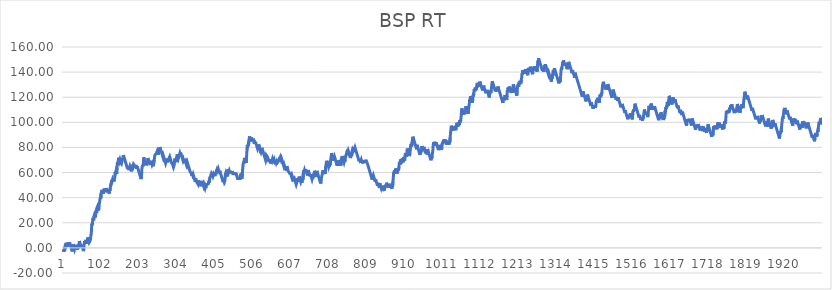
| Category | BSP RT |
|---|---|
| 0 | -1 |
| 1 | -2 |
| 2 | -3 |
| 3 | -1.15 |
| 4 | -2.15 |
| 5 | 1.08 |
| 6 | 2.88 |
| 7 | 1.88 |
| 8 | 3.99 |
| 9 | 2.99 |
| 10 | 1.99 |
| 11 | 0.99 |
| 12 | 2.58 |
| 13 | 4.52 |
| 14 | 3.52 |
| 15 | 2.52 |
| 16 | 1.52 |
| 17 | 4.21 |
| 18 | 3.21 |
| 19 | 2.21 |
| 20 | 1.21 |
| 21 | 0.21 |
| 22 | -0.79 |
| 23 | -1.79 |
| 24 | -2.79 |
| 25 | -0.12 |
| 26 | 2.92 |
| 27 | 1.92 |
| 28 | 0.92 |
| 29 | -0.08 |
| 30 | -1.08 |
| 31 | 0.15 |
| 32 | 1.6 |
| 33 | 0.6 |
| 34 | 2.42 |
| 35 | 1.42 |
| 36 | 0.42 |
| 37 | -0.58 |
| 38 | -1.58 |
| 39 | 1.62 |
| 40 | 0.62 |
| 41 | -0.38 |
| 42 | 3.05 |
| 43 | 5.45 |
| 44 | 4.45 |
| 45 | 3.45 |
| 46 | 2.45 |
| 47 | 1.45 |
| 48 | 0.45 |
| 49 | 2.45 |
| 50 | 1.45 |
| 51 | 0.45 |
| 52 | -0.55 |
| 53 | -1.55 |
| 54 | -2.55 |
| 55 | 0.1 |
| 56 | 3.81 |
| 57 | 5.38 |
| 58 | 4.38 |
| 59 | 3.38 |
| 60 | 6.36 |
| 61 | 5.36 |
| 62 | 4.36 |
| 63 | 3.36 |
| 64 | 4.69 |
| 65 | 8.32 |
| 66 | 7.32 |
| 67 | 6.32 |
| 68 | 5.32 |
| 69 | 4.32 |
| 70 | 4.77 |
| 71 | 3.77 |
| 72 | 6.03 |
| 73 | 8.37 |
| 74 | 10.33 |
| 75 | 13.27 |
| 76 | 19.15 |
| 77 | 18.15 |
| 78 | 20.52 |
| 79 | 23.83 |
| 80 | 22.83 |
| 81 | 21.83 |
| 82 | 25.36 |
| 83 | 26.36 |
| 84 | 25.36 |
| 85 | 24.36 |
| 86 | 25.64 |
| 87 | 27.8 |
| 88 | 28.86 |
| 89 | 27.86 |
| 90 | 31.93 |
| 91 | 32.75 |
| 92 | 31.75 |
| 93 | 30.75 |
| 94 | 29.75 |
| 95 | 33.54 |
| 96 | 35.16 |
| 97 | 35.75 |
| 98 | 39.38 |
| 99 | 40.38 |
| 100 | 39.38 |
| 101 | 43.95 |
| 102 | 42.95 |
| 103 | 46.18 |
| 104 | 45.18 |
| 105 | 44.18 |
| 106 | 43.18 |
| 107 | 44.65 |
| 108 | 46 |
| 109 | 47.31 |
| 110 | 46.31 |
| 111 | 45.31 |
| 112 | 44.31 |
| 113 | 46.52 |
| 114 | 45.52 |
| 115 | 47.59 |
| 116 | 46.59 |
| 117 | 45.59 |
| 118 | 44.59 |
| 119 | 46.26 |
| 120 | 45.26 |
| 121 | 44.26 |
| 122 | 43.26 |
| 123 | 46.4 |
| 124 | 45.4 |
| 125 | 47.35 |
| 126 | 50.33 |
| 127 | 51.13 |
| 128 | 52.38 |
| 129 | 54.19 |
| 130 | 53.19 |
| 131 | 54.3 |
| 132 | 53.3 |
| 133 | 54.96 |
| 134 | 53.96 |
| 135 | 52.96 |
| 136 | 54.56 |
| 137 | 56.52 |
| 138 | 60.64 |
| 139 | 59.64 |
| 140 | 60.85 |
| 141 | 59.85 |
| 142 | 58.85 |
| 143 | 64.12 |
| 144 | 68.04 |
| 145 | 67.04 |
| 146 | 66.04 |
| 147 | 71.83 |
| 148 | 70.83 |
| 149 | 69.83 |
| 150 | 68.83 |
| 151 | 70.07 |
| 152 | 69.07 |
| 153 | 69.39 |
| 154 | 68.39 |
| 155 | 67.39 |
| 156 | 68.68 |
| 157 | 69.85 |
| 158 | 71.8 |
| 159 | 70.8 |
| 160 | 73.9 |
| 161 | 72.9 |
| 162 | 71.9 |
| 163 | 70.9 |
| 164 | 69.9 |
| 165 | 68.9 |
| 166 | 67.9 |
| 167 | 66.9 |
| 168 | 65.9 |
| 169 | 64.9 |
| 170 | 63.9 |
| 171 | 62.9 |
| 172 | 64.93 |
| 173 | 63.93 |
| 174 | 62.93 |
| 175 | 61.93 |
| 176 | 63.99 |
| 177 | 64.95 |
| 178 | 63.95 |
| 179 | 62.95 |
| 180 | 61.95 |
| 181 | 60.95 |
| 182 | 62.35 |
| 183 | 62.65 |
| 184 | 63.51 |
| 185 | 66.44 |
| 186 | 65.44 |
| 187 | 66.69 |
| 188 | 67.48 |
| 189 | 66.48 |
| 190 | 65.48 |
| 191 | 64.48 |
| 192 | 63.48 |
| 193 | 65.93 |
| 194 | 64.93 |
| 195 | 63.93 |
| 196 | 62.93 |
| 197 | 64.77 |
| 198 | 63.77 |
| 199 | 62.77 |
| 200 | 61.77 |
| 201 | 60.77 |
| 202 | 59.77 |
| 203 | 58.77 |
| 204 | 57.77 |
| 205 | 56.77 |
| 206 | 55.77 |
| 207 | 54.77 |
| 208 | 56.49 |
| 209 | 62.87 |
| 210 | 64.67 |
| 211 | 65.97 |
| 212 | 64.97 |
| 213 | 66.98 |
| 214 | 72.08 |
| 215 | 71.08 |
| 216 | 70.08 |
| 217 | 69.08 |
| 218 | 68.08 |
| 219 | 68.73 |
| 220 | 67.73 |
| 221 | 66.73 |
| 222 | 65.73 |
| 223 | 66.26 |
| 224 | 68.45 |
| 225 | 71.54 |
| 226 | 70.54 |
| 227 | 70.97 |
| 228 | 69.97 |
| 229 | 68.97 |
| 230 | 67.97 |
| 231 | 66.97 |
| 232 | 65.97 |
| 233 | 69.28 |
| 234 | 68.28 |
| 235 | 67.28 |
| 236 | 66.28 |
| 237 | 67.09 |
| 238 | 66.09 |
| 239 | 65.09 |
| 240 | 65.43 |
| 241 | 64.43 |
| 242 | 70.07 |
| 243 | 72.98 |
| 244 | 74.08 |
| 245 | 74.67 |
| 246 | 73.67 |
| 247 | 75.1 |
| 248 | 75.51 |
| 249 | 74.51 |
| 250 | 77.25 |
| 251 | 76.25 |
| 252 | 75.25 |
| 253 | 74.25 |
| 254 | 77.73 |
| 255 | 76.73 |
| 256 | 78.7 |
| 257 | 80.24 |
| 258 | 79.24 |
| 259 | 78.24 |
| 260 | 77.24 |
| 261 | 76.24 |
| 262 | 75.24 |
| 263 | 74.24 |
| 264 | 73.24 |
| 265 | 72.24 |
| 266 | 73.47 |
| 267 | 72.47 |
| 268 | 71.47 |
| 269 | 70.47 |
| 270 | 69.47 |
| 271 | 68.47 |
| 272 | 67.47 |
| 273 | 68.64 |
| 274 | 71.14 |
| 275 | 70.14 |
| 276 | 69.14 |
| 277 | 68.14 |
| 278 | 70.59 |
| 279 | 69.59 |
| 280 | 68.59 |
| 281 | 71.28 |
| 282 | 71.61 |
| 283 | 72.66 |
| 284 | 71.66 |
| 285 | 70.66 |
| 286 | 69.66 |
| 287 | 68.66 |
| 288 | 67.66 |
| 289 | 68.28 |
| 290 | 67.28 |
| 291 | 66.28 |
| 292 | 65.28 |
| 293 | 64.28 |
| 294 | 65.19 |
| 295 | 66.01 |
| 296 | 69.71 |
| 297 | 71.21 |
| 298 | 70.21 |
| 299 | 69.21 |
| 300 | 68.21 |
| 301 | 71.98 |
| 302 | 70.98 |
| 303 | 74.41 |
| 304 | 73.41 |
| 305 | 72.41 |
| 306 | 71.41 |
| 307 | 71.88 |
| 308 | 73.59 |
| 309 | 74.39 |
| 310 | 75.41 |
| 311 | 74.41 |
| 312 | 75.86 |
| 313 | 74.86 |
| 314 | 73.86 |
| 315 | 72.86 |
| 316 | 71.86 |
| 317 | 70.86 |
| 318 | 69.86 |
| 319 | 70.8 |
| 320 | 69.8 |
| 321 | 68.8 |
| 322 | 69.51 |
| 323 | 68.51 |
| 324 | 69.56 |
| 325 | 68.56 |
| 326 | 67.56 |
| 327 | 66.56 |
| 328 | 67.71 |
| 329 | 66.71 |
| 330 | 67.86 |
| 331 | 66.86 |
| 332 | 65.86 |
| 333 | 64.86 |
| 334 | 63.86 |
| 335 | 62.86 |
| 336 | 61.86 |
| 337 | 60.86 |
| 338 | 61.35 |
| 339 | 60.35 |
| 340 | 59.35 |
| 341 | 58.35 |
| 342 | 57.35 |
| 343 | 58.92 |
| 344 | 57.92 |
| 345 | 58.73 |
| 346 | 57.73 |
| 347 | 56.73 |
| 348 | 55.73 |
| 349 | 54.73 |
| 350 | 53.73 |
| 351 | 52.73 |
| 352 | 55.28 |
| 353 | 54.28 |
| 354 | 53.28 |
| 355 | 52.28 |
| 356 | 52.79 |
| 357 | 51.79 |
| 358 | 50.79 |
| 359 | 53.82 |
| 360 | 52.82 |
| 361 | 51.82 |
| 362 | 53.09 |
| 363 | 52.09 |
| 364 | 51.09 |
| 365 | 50.09 |
| 366 | 49.09 |
| 367 | 49.5 |
| 368 | 48.5 |
| 369 | 53.37 |
| 370 | 52.37 |
| 371 | 51.37 |
| 372 | 50.37 |
| 373 | 49.37 |
| 374 | 50.57 |
| 375 | 49.57 |
| 376 | 48.57 |
| 377 | 47.57 |
| 378 | 48.66 |
| 379 | 47.66 |
| 380 | 50.63 |
| 381 | 49.63 |
| 382 | 51.14 |
| 383 | 50.14 |
| 384 | 51.51 |
| 385 | 50.51 |
| 386 | 52.09 |
| 387 | 53.04 |
| 388 | 52.04 |
| 389 | 54.67 |
| 390 | 55.4 |
| 391 | 56.69 |
| 392 | 56.98 |
| 393 | 55.98 |
| 394 | 59.53 |
| 395 | 60.25 |
| 396 | 59.25 |
| 397 | 58.25 |
| 398 | 57.25 |
| 399 | 58.18 |
| 400 | 57.18 |
| 401 | 59.27 |
| 402 | 58.27 |
| 403 | 57.27 |
| 404 | 58.7 |
| 405 | 60.07 |
| 406 | 59.07 |
| 407 | 61.25 |
| 408 | 62.06 |
| 409 | 61.06 |
| 410 | 62.72 |
| 411 | 61.72 |
| 412 | 62.82 |
| 413 | 61.82 |
| 414 | 60.82 |
| 415 | 59.82 |
| 416 | 61.38 |
| 417 | 60.38 |
| 418 | 59.38 |
| 419 | 58.38 |
| 420 | 57.38 |
| 421 | 56.38 |
| 422 | 55.38 |
| 423 | 54.38 |
| 424 | 53.38 |
| 425 | 52.38 |
| 426 | 54.22 |
| 427 | 53.22 |
| 428 | 54.26 |
| 429 | 53.26 |
| 430 | 54.32 |
| 431 | 58.93 |
| 432 | 59.83 |
| 433 | 58.83 |
| 434 | 57.83 |
| 435 | 56.83 |
| 436 | 58.72 |
| 437 | 61.27 |
| 438 | 62.61 |
| 439 | 61.61 |
| 440 | 60.61 |
| 441 | 61.47 |
| 442 | 60.47 |
| 443 | 59.47 |
| 444 | 61.31 |
| 445 | 60.31 |
| 446 | 59.31 |
| 447 | 60.88 |
| 448 | 59.88 |
| 449 | 61.15 |
| 450 | 60.15 |
| 451 | 59.15 |
| 452 | 58.15 |
| 453 | 60.13 |
| 454 | 59.13 |
| 455 | 58.13 |
| 456 | 60.11 |
| 457 | 59.11 |
| 458 | 58.11 |
| 459 | 59.46 |
| 460 | 58.46 |
| 461 | 57.46 |
| 462 | 56.46 |
| 463 | 55.46 |
| 464 | 54.46 |
| 465 | 56.41 |
| 466 | 55.41 |
| 467 | 54.41 |
| 468 | 56.38 |
| 469 | 55.38 |
| 470 | 54.38 |
| 471 | 59.06 |
| 472 | 58.06 |
| 473 | 57.06 |
| 474 | 56.06 |
| 475 | 55.06 |
| 476 | 60.33 |
| 477 | 63.37 |
| 478 | 66.51 |
| 479 | 68.21 |
| 480 | 67.21 |
| 481 | 69.71 |
| 482 | 71.72 |
| 483 | 70.72 |
| 484 | 69.72 |
| 485 | 68.72 |
| 486 | 67.72 |
| 487 | 72.03 |
| 488 | 76.93 |
| 489 | 81.86 |
| 490 | 80.86 |
| 491 | 82.02 |
| 492 | 81.02 |
| 493 | 84.06 |
| 494 | 86.31 |
| 495 | 88.81 |
| 496 | 87.81 |
| 497 | 86.81 |
| 498 | 85.81 |
| 499 | 84.81 |
| 500 | 87.99 |
| 501 | 86.99 |
| 502 | 85.99 |
| 503 | 84.99 |
| 504 | 86.85 |
| 505 | 85.85 |
| 506 | 84.85 |
| 507 | 83.85 |
| 508 | 82.85 |
| 509 | 84.67 |
| 510 | 85.34 |
| 511 | 84.34 |
| 512 | 83.34 |
| 513 | 82.34 |
| 514 | 81.34 |
| 515 | 80.34 |
| 516 | 79.34 |
| 517 | 80.43 |
| 518 | 82.37 |
| 519 | 81.37 |
| 520 | 80.37 |
| 521 | 79.37 |
| 522 | 78.37 |
| 523 | 79.25 |
| 524 | 78.25 |
| 525 | 77.25 |
| 526 | 76.25 |
| 527 | 77.06 |
| 528 | 79.63 |
| 529 | 78.63 |
| 530 | 77.63 |
| 531 | 76.63 |
| 532 | 75.63 |
| 533 | 74.63 |
| 534 | 73.63 |
| 535 | 72.63 |
| 536 | 71.63 |
| 537 | 70.63 |
| 538 | 69.63 |
| 539 | 70.87 |
| 540 | 73.7 |
| 541 | 74.37 |
| 542 | 73.37 |
| 543 | 72.37 |
| 544 | 71.37 |
| 545 | 70.37 |
| 546 | 69.37 |
| 547 | 68.37 |
| 548 | 70.26 |
| 549 | 69.26 |
| 550 | 68.26 |
| 551 | 67.26 |
| 552 | 68.8 |
| 553 | 67.8 |
| 554 | 70.74 |
| 555 | 69.74 |
| 556 | 70.84 |
| 557 | 69.84 |
| 558 | 70.57 |
| 559 | 69.57 |
| 560 | 68.57 |
| 561 | 69.8 |
| 562 | 68.8 |
| 563 | 69.07 |
| 564 | 68.07 |
| 565 | 68.71 |
| 566 | 67.71 |
| 567 | 68.53 |
| 568 | 67.53 |
| 569 | 69.57 |
| 570 | 68.57 |
| 571 | 68.76 |
| 572 | 69.57 |
| 573 | 68.57 |
| 574 | 70.49 |
| 575 | 72.46 |
| 576 | 71.46 |
| 577 | 72.28 |
| 578 | 71.28 |
| 579 | 70.28 |
| 580 | 71.12 |
| 581 | 70.12 |
| 582 | 69.12 |
| 583 | 68.12 |
| 584 | 67.12 |
| 585 | 66.12 |
| 586 | 65.12 |
| 587 | 66.12 |
| 588 | 65.12 |
| 589 | 64.12 |
| 590 | 64.35 |
| 591 | 63.35 |
| 592 | 62.35 |
| 593 | 61.35 |
| 594 | 65.07 |
| 595 | 64.07 |
| 596 | 63.07 |
| 597 | 62.07 |
| 598 | 61.07 |
| 599 | 61.65 |
| 600 | 60.65 |
| 601 | 59.65 |
| 602 | 58.65 |
| 603 | 60.36 |
| 604 | 59.36 |
| 605 | 58.36 |
| 606 | 57.36 |
| 607 | 56.36 |
| 608 | 57.41 |
| 609 | 56.41 |
| 610 | 55.41 |
| 611 | 54.41 |
| 612 | 55.14 |
| 613 | 54.14 |
| 614 | 55.49 |
| 615 | 54.49 |
| 616 | 53.49 |
| 617 | 52.49 |
| 618 | 51.49 |
| 619 | 50.49 |
| 620 | 51.49 |
| 621 | 53.49 |
| 622 | 52.49 |
| 623 | 55.53 |
| 624 | 54.53 |
| 625 | 53.53 |
| 626 | 52.53 |
| 627 | 56.74 |
| 628 | 55.74 |
| 629 | 54.74 |
| 630 | 53.74 |
| 631 | 52.74 |
| 632 | 53.86 |
| 633 | 52.86 |
| 634 | 51.86 |
| 635 | 52.35 |
| 636 | 55.38 |
| 637 | 54.38 |
| 638 | 59.27 |
| 639 | 61.96 |
| 640 | 60.96 |
| 641 | 62.01 |
| 642 | 61.01 |
| 643 | 60.01 |
| 644 | 62.66 |
| 645 | 61.66 |
| 646 | 60.66 |
| 647 | 59.66 |
| 648 | 58.66 |
| 649 | 57.66 |
| 650 | 60.7 |
| 651 | 61.97 |
| 652 | 60.97 |
| 653 | 59.97 |
| 654 | 58.97 |
| 655 | 57.97 |
| 656 | 56.97 |
| 657 | 58.64 |
| 658 | 57.64 |
| 659 | 56.64 |
| 660 | 55.64 |
| 661 | 54.64 |
| 662 | 55.83 |
| 663 | 54.83 |
| 664 | 58.61 |
| 665 | 57.61 |
| 666 | 56.61 |
| 667 | 58.71 |
| 668 | 61.42 |
| 669 | 60.42 |
| 670 | 59.42 |
| 671 | 58.42 |
| 672 | 57.42 |
| 673 | 56.42 |
| 674 | 61.3 |
| 675 | 60.3 |
| 676 | 59.3 |
| 677 | 58.3 |
| 678 | 57.3 |
| 679 | 56.3 |
| 680 | 55.3 |
| 681 | 54.3 |
| 682 | 53.3 |
| 683 | 52.3 |
| 684 | 51.3 |
| 685 | 52.62 |
| 686 | 55.62 |
| 687 | 56.15 |
| 688 | 58.57 |
| 689 | 59.83 |
| 690 | 61.79 |
| 691 | 60.79 |
| 692 | 59.79 |
| 693 | 58.79 |
| 694 | 61.15 |
| 695 | 60.15 |
| 696 | 59.15 |
| 697 | 64.32 |
| 698 | 65.62 |
| 699 | 67.92 |
| 700 | 69.36 |
| 701 | 68.36 |
| 702 | 67.36 |
| 703 | 66.36 |
| 704 | 65.36 |
| 705 | 64.36 |
| 706 | 65.41 |
| 707 | 64.41 |
| 708 | 66.66 |
| 709 | 65.66 |
| 710 | 68.26 |
| 711 | 71.15 |
| 712 | 73.09 |
| 713 | 75.44 |
| 714 | 74.44 |
| 715 | 73.44 |
| 716 | 72.44 |
| 717 | 71.44 |
| 718 | 70.44 |
| 719 | 69.44 |
| 720 | 71.11 |
| 721 | 72.36 |
| 722 | 71.36 |
| 723 | 70.36 |
| 724 | 69.36 |
| 725 | 68.36 |
| 726 | 67.36 |
| 727 | 66.36 |
| 728 | 65.36 |
| 729 | 68.3 |
| 730 | 67.3 |
| 731 | 69.65 |
| 732 | 68.65 |
| 733 | 67.65 |
| 734 | 66.65 |
| 735 | 65.65 |
| 736 | 67.64 |
| 737 | 66.64 |
| 738 | 65.64 |
| 739 | 70.74 |
| 740 | 71.62 |
| 741 | 73.17 |
| 742 | 72.17 |
| 743 | 71.17 |
| 744 | 70.17 |
| 745 | 69.17 |
| 746 | 68.17 |
| 747 | 69.4 |
| 748 | 68.4 |
| 749 | 70.65 |
| 750 | 72.03 |
| 751 | 73.5 |
| 752 | 73.75 |
| 753 | 75.34 |
| 754 | 74.34 |
| 755 | 77.68 |
| 756 | 76.68 |
| 757 | 77.58 |
| 758 | 76.58 |
| 759 | 75.58 |
| 760 | 74.58 |
| 761 | 73.58 |
| 762 | 72.58 |
| 763 | 71.58 |
| 764 | 72.95 |
| 765 | 74.42 |
| 766 | 75.44 |
| 767 | 76.48 |
| 768 | 77.64 |
| 769 | 76.64 |
| 770 | 77.89 |
| 771 | 79.73 |
| 772 | 78.73 |
| 773 | 80.31 |
| 774 | 79.31 |
| 775 | 80.14 |
| 776 | 79.14 |
| 777 | 78.14 |
| 778 | 77.14 |
| 779 | 76.14 |
| 780 | 75.14 |
| 781 | 74.14 |
| 782 | 73.14 |
| 783 | 72.14 |
| 784 | 71.14 |
| 785 | 70.14 |
| 786 | 69.14 |
| 787 | 70.65 |
| 788 | 69.65 |
| 789 | 68.65 |
| 790 | 67.65 |
| 791 | 69.06 |
| 792 | 70.08 |
| 793 | 69.08 |
| 794 | 69.24 |
| 795 | 68.24 |
| 796 | 67.24 |
| 797 | 68.68 |
| 798 | 67.68 |
| 799 | 69.79 |
| 800 | 68.79 |
| 801 | 67.79 |
| 802 | 69.21 |
| 803 | 68.21 |
| 804 | 70.16 |
| 805 | 69.16 |
| 806 | 68.16 |
| 807 | 68.35 |
| 808 | 67.35 |
| 809 | 66.35 |
| 810 | 65.35 |
| 811 | 64.35 |
| 812 | 63.35 |
| 813 | 62.35 |
| 814 | 61.35 |
| 815 | 60.35 |
| 816 | 59.35 |
| 817 | 58.35 |
| 818 | 57.35 |
| 819 | 56.35 |
| 820 | 55.35 |
| 821 | 54.35 |
| 822 | 55.88 |
| 823 | 56.76 |
| 824 | 57.73 |
| 825 | 56.73 |
| 826 | 55.73 |
| 827 | 54.73 |
| 828 | 53.73 |
| 829 | 52.73 |
| 830 | 54.47 |
| 831 | 53.47 |
| 832 | 52.47 |
| 833 | 51.47 |
| 834 | 50.47 |
| 835 | 49.47 |
| 836 | 51.82 |
| 837 | 50.82 |
| 838 | 49.82 |
| 839 | 48.82 |
| 840 | 47.82 |
| 841 | 51.45 |
| 842 | 50.45 |
| 843 | 49.45 |
| 844 | 48.45 |
| 845 | 47.45 |
| 846 | 48.38 |
| 847 | 48.55 |
| 848 | 47.55 |
| 849 | 49.56 |
| 850 | 48.56 |
| 851 | 47.56 |
| 852 | 46.56 |
| 853 | 45.56 |
| 854 | 47.84 |
| 855 | 49.64 |
| 856 | 48.64 |
| 857 | 50.08 |
| 858 | 49.08 |
| 859 | 51.87 |
| 860 | 50.87 |
| 861 | 49.87 |
| 862 | 48.87 |
| 863 | 47.87 |
| 864 | 49.77 |
| 865 | 48.77 |
| 866 | 51.03 |
| 867 | 50.03 |
| 868 | 49.03 |
| 869 | 48.03 |
| 870 | 49.98 |
| 871 | 48.98 |
| 872 | 47.98 |
| 873 | 46.98 |
| 874 | 49.74 |
| 875 | 48.74 |
| 876 | 52.76 |
| 877 | 55.99 |
| 878 | 60.12 |
| 879 | 59.12 |
| 880 | 61.76 |
| 881 | 60.76 |
| 882 | 59.76 |
| 883 | 63.21 |
| 884 | 62.21 |
| 885 | 61.21 |
| 886 | 60.21 |
| 887 | 59.21 |
| 888 | 62.08 |
| 889 | 61.08 |
| 890 | 63.14 |
| 891 | 62.14 |
| 892 | 64.52 |
| 893 | 68.24 |
| 894 | 67.24 |
| 895 | 66.24 |
| 896 | 70.36 |
| 897 | 69.36 |
| 898 | 68.36 |
| 899 | 67.36 |
| 900 | 71.14 |
| 901 | 70.14 |
| 902 | 69.14 |
| 903 | 68.14 |
| 904 | 72.33 |
| 905 | 71.33 |
| 906 | 70.33 |
| 907 | 69.33 |
| 908 | 72.97 |
| 909 | 75.62 |
| 910 | 74.62 |
| 911 | 73.62 |
| 912 | 72.62 |
| 913 | 75.5 |
| 914 | 79.13 |
| 915 | 78.13 |
| 916 | 77.13 |
| 917 | 76.13 |
| 918 | 75.13 |
| 919 | 74.13 |
| 920 | 73.13 |
| 921 | 75.09 |
| 922 | 77.87 |
| 923 | 80.91 |
| 924 | 82.77 |
| 925 | 81.77 |
| 926 | 80.77 |
| 927 | 84.39 |
| 928 | 86.4 |
| 929 | 88.56 |
| 930 | 87.56 |
| 931 | 86.56 |
| 932 | 85.56 |
| 933 | 84.56 |
| 934 | 83.56 |
| 935 | 82.56 |
| 936 | 81.56 |
| 937 | 80.56 |
| 938 | 79.56 |
| 939 | 78.56 |
| 940 | 82.08 |
| 941 | 81.08 |
| 942 | 80.08 |
| 943 | 79.08 |
| 944 | 78.08 |
| 945 | 77.08 |
| 946 | 76.08 |
| 947 | 75.08 |
| 948 | 74.08 |
| 949 | 76.6 |
| 950 | 75.6 |
| 951 | 78.61 |
| 952 | 77.61 |
| 953 | 81.04 |
| 954 | 80.04 |
| 955 | 79.04 |
| 956 | 78.04 |
| 957 | 77.04 |
| 958 | 80.37 |
| 959 | 79.37 |
| 960 | 78.37 |
| 961 | 77.37 |
| 962 | 76.37 |
| 963 | 75.37 |
| 964 | 77.4 |
| 965 | 76.4 |
| 966 | 75.4 |
| 967 | 74.4 |
| 968 | 78.78 |
| 969 | 77.78 |
| 970 | 76.78 |
| 971 | 75.78 |
| 972 | 74.78 |
| 973 | 73.78 |
| 974 | 72.78 |
| 975 | 71.78 |
| 976 | 70.78 |
| 977 | 69.78 |
| 978 | 71.86 |
| 979 | 70.86 |
| 980 | 73.3 |
| 981 | 75.24 |
| 982 | 77.44 |
| 983 | 81.83 |
| 984 | 84.16 |
| 985 | 83.16 |
| 986 | 82.16 |
| 987 | 84.46 |
| 988 | 83.46 |
| 989 | 82.46 |
| 990 | 81.46 |
| 991 | 83.87 |
| 992 | 82.87 |
| 993 | 81.87 |
| 994 | 80.87 |
| 995 | 79.87 |
| 996 | 78.87 |
| 997 | 77.87 |
| 998 | 81.06 |
| 999 | 80.06 |
| 1000 | 79.06 |
| 1001 | 82.03 |
| 1002 | 81.03 |
| 1003 | 80.03 |
| 1004 | 79.03 |
| 1005 | 78.03 |
| 1006 | 79.95 |
| 1007 | 83.67 |
| 1008 | 82.67 |
| 1009 | 84.68 |
| 1010 | 83.68 |
| 1011 | 86.18 |
| 1012 | 85.18 |
| 1013 | 84.18 |
| 1014 | 86.38 |
| 1015 | 85.38 |
| 1016 | 84.38 |
| 1017 | 83.38 |
| 1018 | 82.38 |
| 1019 | 85.32 |
| 1020 | 84.32 |
| 1021 | 83.32 |
| 1022 | 82.32 |
| 1023 | 84.34 |
| 1024 | 83.34 |
| 1025 | 82.34 |
| 1026 | 84.99 |
| 1027 | 83.99 |
| 1028 | 87.91 |
| 1029 | 91.22 |
| 1030 | 94.29 |
| 1031 | 97.33 |
| 1032 | 96.33 |
| 1033 | 95.33 |
| 1034 | 94.33 |
| 1035 | 93.33 |
| 1036 | 96.96 |
| 1037 | 95.96 |
| 1038 | 94.96 |
| 1039 | 93.96 |
| 1040 | 96.68 |
| 1041 | 95.68 |
| 1042 | 94.68 |
| 1043 | 93.68 |
| 1044 | 97.35 |
| 1045 | 96.35 |
| 1046 | 99.64 |
| 1047 | 98.64 |
| 1048 | 97.64 |
| 1049 | 96.64 |
| 1050 | 99.78 |
| 1051 | 98.78 |
| 1052 | 97.78 |
| 1053 | 101.8 |
| 1054 | 100.8 |
| 1055 | 99.8 |
| 1056 | 101.38 |
| 1057 | 104.12 |
| 1058 | 108.17 |
| 1059 | 111.11 |
| 1060 | 110.11 |
| 1061 | 109.11 |
| 1062 | 108.11 |
| 1063 | 107.11 |
| 1064 | 106.11 |
| 1065 | 108.61 |
| 1066 | 107.61 |
| 1067 | 106.61 |
| 1068 | 109.16 |
| 1069 | 108.16 |
| 1070 | 112.81 |
| 1071 | 111.81 |
| 1072 | 110.81 |
| 1073 | 109.81 |
| 1074 | 108.81 |
| 1075 | 107.81 |
| 1076 | 106.81 |
| 1077 | 110.35 |
| 1078 | 113.04 |
| 1079 | 115.2 |
| 1080 | 118.19 |
| 1081 | 117.19 |
| 1082 | 120.72 |
| 1083 | 119.72 |
| 1084 | 118.72 |
| 1085 | 117.72 |
| 1086 | 116.72 |
| 1087 | 115.72 |
| 1088 | 118.25 |
| 1089 | 121.79 |
| 1090 | 120.79 |
| 1091 | 123.69 |
| 1092 | 126.72 |
| 1093 | 125.72 |
| 1094 | 124.72 |
| 1095 | 127.71 |
| 1096 | 126.71 |
| 1097 | 125.71 |
| 1098 | 128.52 |
| 1099 | 127.52 |
| 1100 | 131.39 |
| 1101 | 130.39 |
| 1102 | 129.39 |
| 1103 | 128.39 |
| 1104 | 131.51 |
| 1105 | 130.51 |
| 1106 | 129.51 |
| 1107 | 132.38 |
| 1108 | 131.38 |
| 1109 | 130.38 |
| 1110 | 129.38 |
| 1111 | 128.38 |
| 1112 | 127.38 |
| 1113 | 126.38 |
| 1114 | 125.38 |
| 1115 | 127.71 |
| 1116 | 126.71 |
| 1117 | 129.19 |
| 1118 | 128.19 |
| 1119 | 127.19 |
| 1120 | 126.19 |
| 1121 | 125.19 |
| 1122 | 124.19 |
| 1123 | 123.19 |
| 1124 | 125.15 |
| 1125 | 124.15 |
| 1126 | 125.83 |
| 1127 | 124.83 |
| 1128 | 123.83 |
| 1129 | 122.83 |
| 1130 | 121.83 |
| 1131 | 120.83 |
| 1132 | 119.83 |
| 1133 | 122.53 |
| 1134 | 125.27 |
| 1135 | 124.27 |
| 1136 | 123.27 |
| 1137 | 125.33 |
| 1138 | 128.25 |
| 1139 | 130.8 |
| 1140 | 132.76 |
| 1141 | 131.76 |
| 1142 | 130.76 |
| 1143 | 129.76 |
| 1144 | 128.76 |
| 1145 | 127.76 |
| 1146 | 126.76 |
| 1147 | 125.76 |
| 1148 | 124.76 |
| 1149 | 126.57 |
| 1150 | 125.57 |
| 1151 | 124.57 |
| 1152 | 127.9 |
| 1153 | 126.9 |
| 1154 | 125.9 |
| 1155 | 128.52 |
| 1156 | 127.52 |
| 1157 | 126.52 |
| 1158 | 125.52 |
| 1159 | 124.52 |
| 1160 | 123.52 |
| 1161 | 122.52 |
| 1162 | 121.52 |
| 1163 | 120.52 |
| 1164 | 119.52 |
| 1165 | 118.52 |
| 1166 | 117.52 |
| 1167 | 116.52 |
| 1168 | 115.52 |
| 1169 | 119.54 |
| 1170 | 118.54 |
| 1171 | 117.54 |
| 1172 | 120.16 |
| 1173 | 119.16 |
| 1174 | 121.75 |
| 1175 | 120.75 |
| 1176 | 119.75 |
| 1177 | 118.75 |
| 1178 | 117.75 |
| 1179 | 121.4 |
| 1180 | 125.52 |
| 1181 | 124.52 |
| 1182 | 127.55 |
| 1183 | 126.55 |
| 1184 | 125.55 |
| 1185 | 128.44 |
| 1186 | 127.44 |
| 1187 | 126.44 |
| 1188 | 125.44 |
| 1189 | 124.44 |
| 1190 | 123.44 |
| 1191 | 125.4 |
| 1192 | 124.4 |
| 1193 | 123.4 |
| 1194 | 127.61 |
| 1195 | 126.61 |
| 1196 | 130.2 |
| 1197 | 129.2 |
| 1198 | 128.2 |
| 1199 | 127.2 |
| 1200 | 126.2 |
| 1201 | 125.2 |
| 1202 | 124.2 |
| 1203 | 123.2 |
| 1204 | 122.2 |
| 1205 | 121.2 |
| 1206 | 125.32 |
| 1207 | 128.25 |
| 1208 | 130.15 |
| 1209 | 129.15 |
| 1210 | 128.15 |
| 1211 | 131.94 |
| 1212 | 130.94 |
| 1213 | 129.94 |
| 1214 | 133.13 |
| 1215 | 132.13 |
| 1216 | 131.13 |
| 1217 | 133.87 |
| 1218 | 135.59 |
| 1219 | 138.92 |
| 1220 | 137.92 |
| 1221 | 141.59 |
| 1222 | 140.59 |
| 1223 | 139.59 |
| 1224 | 138.59 |
| 1225 | 141.68 |
| 1226 | 140.68 |
| 1227 | 139.68 |
| 1228 | 138.68 |
| 1229 | 142.5 |
| 1230 | 141.5 |
| 1231 | 140.5 |
| 1232 | 139.5 |
| 1233 | 138.5 |
| 1234 | 137.5 |
| 1235 | 140.34 |
| 1236 | 143.37 |
| 1237 | 142.37 |
| 1238 | 141.37 |
| 1239 | 140.37 |
| 1240 | 142.42 |
| 1241 | 144.31 |
| 1242 | 143.31 |
| 1243 | 142.31 |
| 1244 | 141.31 |
| 1245 | 140.31 |
| 1246 | 139.31 |
| 1247 | 138.31 |
| 1248 | 142.33 |
| 1249 | 144.25 |
| 1250 | 143.25 |
| 1251 | 142.25 |
| 1252 | 144.47 |
| 1253 | 143.47 |
| 1254 | 142.47 |
| 1255 | 141.47 |
| 1256 | 143.34 |
| 1257 | 142.34 |
| 1258 | 141.34 |
| 1259 | 140.34 |
| 1260 | 145.14 |
| 1261 | 149.06 |
| 1262 | 148.06 |
| 1263 | 151 |
| 1264 | 150 |
| 1265 | 149 |
| 1266 | 148 |
| 1267 | 147 |
| 1268 | 146 |
| 1269 | 145 |
| 1270 | 144 |
| 1271 | 143 |
| 1272 | 142 |
| 1273 | 141 |
| 1274 | 143.21 |
| 1275 | 142.21 |
| 1276 | 141.21 |
| 1277 | 140.21 |
| 1278 | 145.31 |
| 1279 | 144.31 |
| 1280 | 143.31 |
| 1281 | 146.2 |
| 1282 | 145.2 |
| 1283 | 144.2 |
| 1284 | 143.2 |
| 1285 | 142.2 |
| 1286 | 141.2 |
| 1287 | 140.2 |
| 1288 | 139.2 |
| 1289 | 138.2 |
| 1290 | 139.35 |
| 1291 | 138.35 |
| 1292 | 137.35 |
| 1293 | 136.35 |
| 1294 | 135.35 |
| 1295 | 134.35 |
| 1296 | 133.35 |
| 1297 | 132.35 |
| 1298 | 135.96 |
| 1299 | 134.96 |
| 1300 | 138.12 |
| 1301 | 137.12 |
| 1302 | 141.6 |
| 1303 | 140.6 |
| 1304 | 139.6 |
| 1305 | 143.03 |
| 1306 | 142.03 |
| 1307 | 141.03 |
| 1308 | 140.03 |
| 1309 | 139.03 |
| 1310 | 138.03 |
| 1311 | 137.03 |
| 1312 | 136.03 |
| 1313 | 135.03 |
| 1314 | 134.03 |
| 1315 | 133.03 |
| 1316 | 132.03 |
| 1317 | 131.03 |
| 1318 | 133.97 |
| 1319 | 132.97 |
| 1320 | 131.97 |
| 1321 | 134.81 |
| 1322 | 138.83 |
| 1323 | 142.84 |
| 1324 | 141.84 |
| 1325 | 143.93 |
| 1326 | 145.65 |
| 1327 | 147.81 |
| 1328 | 146.81 |
| 1329 | 149.25 |
| 1330 | 148.25 |
| 1331 | 147.25 |
| 1332 | 146.25 |
| 1333 | 145.25 |
| 1334 | 147.31 |
| 1335 | 146.31 |
| 1336 | 145.31 |
| 1337 | 144.31 |
| 1338 | 143.31 |
| 1339 | 142.31 |
| 1340 | 144.15 |
| 1341 | 143.15 |
| 1342 | 145.42 |
| 1343 | 148.16 |
| 1344 | 147.16 |
| 1345 | 146.16 |
| 1346 | 145.16 |
| 1347 | 144.16 |
| 1348 | 143.16 |
| 1349 | 142.16 |
| 1350 | 141.16 |
| 1351 | 140.16 |
| 1352 | 139.16 |
| 1353 | 141.54 |
| 1354 | 140.54 |
| 1355 | 139.54 |
| 1356 | 138.54 |
| 1357 | 137.54 |
| 1358 | 136.54 |
| 1359 | 135.54 |
| 1360 | 139.46 |
| 1361 | 138.46 |
| 1362 | 137.46 |
| 1363 | 136.46 |
| 1364 | 135.46 |
| 1365 | 134.46 |
| 1366 | 133.46 |
| 1367 | 132.46 |
| 1368 | 131.46 |
| 1369 | 130.46 |
| 1370 | 129.46 |
| 1371 | 128.46 |
| 1372 | 127.46 |
| 1373 | 126.46 |
| 1374 | 125.46 |
| 1375 | 124.46 |
| 1376 | 123.46 |
| 1377 | 122.46 |
| 1378 | 121.46 |
| 1379 | 120.46 |
| 1380 | 122.39 |
| 1381 | 124.67 |
| 1382 | 123.67 |
| 1383 | 122.67 |
| 1384 | 121.67 |
| 1385 | 120.67 |
| 1386 | 119.67 |
| 1387 | 118.67 |
| 1388 | 117.67 |
| 1389 | 116.67 |
| 1390 | 118.63 |
| 1391 | 117.63 |
| 1392 | 119.55 |
| 1393 | 122.09 |
| 1394 | 121.09 |
| 1395 | 120.09 |
| 1396 | 119.09 |
| 1397 | 118.09 |
| 1398 | 117.09 |
| 1399 | 116.09 |
| 1400 | 115.09 |
| 1401 | 114.09 |
| 1402 | 113.09 |
| 1403 | 115.79 |
| 1404 | 114.79 |
| 1405 | 113.79 |
| 1406 | 112.79 |
| 1407 | 111.79 |
| 1408 | 110.79 |
| 1409 | 113.51 |
| 1410 | 112.51 |
| 1411 | 111.51 |
| 1412 | 113.48 |
| 1413 | 112.48 |
| 1414 | 111.48 |
| 1415 | 113.73 |
| 1416 | 116.59 |
| 1417 | 115.59 |
| 1418 | 118.19 |
| 1419 | 117.19 |
| 1420 | 119.54 |
| 1421 | 118.54 |
| 1422 | 117.54 |
| 1423 | 116.54 |
| 1424 | 115.54 |
| 1425 | 120.12 |
| 1426 | 121.94 |
| 1427 | 120.94 |
| 1428 | 119.94 |
| 1429 | 122.63 |
| 1430 | 121.63 |
| 1431 | 123.64 |
| 1432 | 126.48 |
| 1433 | 130.01 |
| 1434 | 129.01 |
| 1435 | 132.24 |
| 1436 | 131.24 |
| 1437 | 130.24 |
| 1438 | 129.24 |
| 1439 | 128.24 |
| 1440 | 127.24 |
| 1441 | 126.24 |
| 1442 | 128.96 |
| 1443 | 127.96 |
| 1444 | 126.96 |
| 1445 | 125.96 |
| 1446 | 128.21 |
| 1447 | 130.46 |
| 1448 | 129.46 |
| 1449 | 128.46 |
| 1450 | 127.46 |
| 1451 | 126.46 |
| 1452 | 125.46 |
| 1453 | 124.46 |
| 1454 | 123.46 |
| 1455 | 122.46 |
| 1456 | 121.46 |
| 1457 | 120.46 |
| 1458 | 119.46 |
| 1459 | 123.09 |
| 1460 | 122.09 |
| 1461 | 126.01 |
| 1462 | 125.01 |
| 1463 | 124.01 |
| 1464 | 123.01 |
| 1465 | 122.01 |
| 1466 | 121.01 |
| 1467 | 120.01 |
| 1468 | 119.01 |
| 1469 | 118.01 |
| 1470 | 120.14 |
| 1471 | 119.14 |
| 1472 | 118.14 |
| 1473 | 117.14 |
| 1474 | 119.95 |
| 1475 | 118.95 |
| 1476 | 117.95 |
| 1477 | 116.95 |
| 1478 | 115.95 |
| 1479 | 114.95 |
| 1480 | 113.95 |
| 1481 | 112.95 |
| 1482 | 111.95 |
| 1483 | 113.78 |
| 1484 | 112.78 |
| 1485 | 114.63 |
| 1486 | 113.63 |
| 1487 | 112.63 |
| 1488 | 111.63 |
| 1489 | 110.63 |
| 1490 | 109.63 |
| 1491 | 108.63 |
| 1492 | 107.63 |
| 1493 | 109.45 |
| 1494 | 108.45 |
| 1495 | 107.45 |
| 1496 | 106.45 |
| 1497 | 105.45 |
| 1498 | 104.45 |
| 1499 | 103.45 |
| 1500 | 102.45 |
| 1501 | 104.32 |
| 1502 | 103.32 |
| 1503 | 105.04 |
| 1504 | 104.04 |
| 1505 | 106.05 |
| 1506 | 105.05 |
| 1507 | 107.35 |
| 1508 | 106.35 |
| 1509 | 105.35 |
| 1510 | 104.35 |
| 1511 | 103.35 |
| 1512 | 102.35 |
| 1513 | 106.83 |
| 1514 | 109.37 |
| 1515 | 108.37 |
| 1516 | 110.24 |
| 1517 | 109.24 |
| 1518 | 112.25 |
| 1519 | 114.88 |
| 1520 | 113.88 |
| 1521 | 112.88 |
| 1522 | 111.88 |
| 1523 | 110.88 |
| 1524 | 109.88 |
| 1525 | 108.88 |
| 1526 | 107.88 |
| 1527 | 106.88 |
| 1528 | 105.88 |
| 1529 | 104.88 |
| 1530 | 103.88 |
| 1531 | 105.79 |
| 1532 | 104.79 |
| 1533 | 103.79 |
| 1534 | 102.79 |
| 1535 | 101.79 |
| 1536 | 104.24 |
| 1537 | 103.24 |
| 1538 | 102.24 |
| 1539 | 101.24 |
| 1540 | 104.08 |
| 1541 | 103.08 |
| 1542 | 105.68 |
| 1543 | 107.9 |
| 1544 | 110.2 |
| 1545 | 109.2 |
| 1546 | 108.2 |
| 1547 | 107.2 |
| 1548 | 106.2 |
| 1549 | 108.16 |
| 1550 | 107.16 |
| 1551 | 106.16 |
| 1552 | 105.16 |
| 1553 | 104.16 |
| 1554 | 107.52 |
| 1555 | 109.47 |
| 1556 | 113.08 |
| 1557 | 112.08 |
| 1558 | 111.08 |
| 1559 | 110.08 |
| 1560 | 113.61 |
| 1561 | 112.61 |
| 1562 | 114.88 |
| 1563 | 113.88 |
| 1564 | 112.88 |
| 1565 | 111.88 |
| 1566 | 110.88 |
| 1567 | 109.88 |
| 1568 | 112.23 |
| 1569 | 111.23 |
| 1570 | 110.23 |
| 1571 | 112.69 |
| 1572 | 111.69 |
| 1573 | 110.69 |
| 1574 | 109.69 |
| 1575 | 108.69 |
| 1576 | 107.69 |
| 1577 | 106.69 |
| 1578 | 105.69 |
| 1579 | 104.69 |
| 1580 | 103.69 |
| 1581 | 102.69 |
| 1582 | 101.69 |
| 1583 | 103.99 |
| 1584 | 102.99 |
| 1585 | 106.51 |
| 1586 | 105.51 |
| 1587 | 104.51 |
| 1588 | 107.84 |
| 1589 | 106.84 |
| 1590 | 105.84 |
| 1591 | 104.84 |
| 1592 | 103.84 |
| 1593 | 102.84 |
| 1594 | 101.84 |
| 1595 | 103.49 |
| 1596 | 102.49 |
| 1597 | 105.79 |
| 1598 | 104.79 |
| 1599 | 109.1 |
| 1600 | 108.1 |
| 1601 | 111.95 |
| 1602 | 110.95 |
| 1603 | 113.06 |
| 1604 | 112.06 |
| 1605 | 116.27 |
| 1606 | 115.27 |
| 1607 | 114.27 |
| 1608 | 113.27 |
| 1609 | 118.11 |
| 1610 | 121.15 |
| 1611 | 120.15 |
| 1612 | 119.15 |
| 1613 | 118.15 |
| 1614 | 117.15 |
| 1615 | 116.15 |
| 1616 | 115.15 |
| 1617 | 114.15 |
| 1618 | 118.92 |
| 1619 | 117.92 |
| 1620 | 119.82 |
| 1621 | 118.82 |
| 1622 | 117.82 |
| 1623 | 116.82 |
| 1624 | 115.82 |
| 1625 | 118.31 |
| 1626 | 117.31 |
| 1627 | 116.31 |
| 1628 | 115.31 |
| 1629 | 114.31 |
| 1630 | 113.31 |
| 1631 | 112.31 |
| 1632 | 111.31 |
| 1633 | 113.28 |
| 1634 | 112.28 |
| 1635 | 111.28 |
| 1636 | 110.28 |
| 1637 | 109.28 |
| 1638 | 108.28 |
| 1639 | 107.28 |
| 1640 | 109.8 |
| 1641 | 108.8 |
| 1642 | 107.8 |
| 1643 | 106.8 |
| 1644 | 105.8 |
| 1645 | 108.36 |
| 1646 | 107.36 |
| 1647 | 106.36 |
| 1648 | 105.36 |
| 1649 | 104.36 |
| 1650 | 103.36 |
| 1651 | 102.36 |
| 1652 | 101.36 |
| 1653 | 100.36 |
| 1654 | 99.36 |
| 1655 | 98.36 |
| 1656 | 97.36 |
| 1657 | 100.25 |
| 1658 | 102.57 |
| 1659 | 101.57 |
| 1660 | 100.57 |
| 1661 | 102.77 |
| 1662 | 101.77 |
| 1663 | 100.77 |
| 1664 | 102.51 |
| 1665 | 101.51 |
| 1666 | 100.51 |
| 1667 | 99.51 |
| 1668 | 98.51 |
| 1669 | 97.51 |
| 1670 | 101.06 |
| 1671 | 103.12 |
| 1672 | 102.12 |
| 1673 | 101.12 |
| 1674 | 100.12 |
| 1675 | 99.12 |
| 1676 | 98.12 |
| 1677 | 97.12 |
| 1678 | 96.12 |
| 1679 | 95.12 |
| 1680 | 94.12 |
| 1681 | 97.65 |
| 1682 | 96.65 |
| 1683 | 95.65 |
| 1684 | 98.1 |
| 1685 | 97.1 |
| 1686 | 96.1 |
| 1687 | 98.51 |
| 1688 | 97.51 |
| 1689 | 96.51 |
| 1690 | 95.51 |
| 1691 | 94.51 |
| 1692 | 93.51 |
| 1693 | 95.5 |
| 1694 | 94.5 |
| 1695 | 97 |
| 1696 | 96 |
| 1697 | 95 |
| 1698 | 94 |
| 1699 | 93 |
| 1700 | 96.65 |
| 1701 | 95.65 |
| 1702 | 94.65 |
| 1703 | 93.65 |
| 1704 | 92.65 |
| 1705 | 95.54 |
| 1706 | 94.54 |
| 1707 | 93.54 |
| 1708 | 92.54 |
| 1709 | 91.54 |
| 1710 | 94.03 |
| 1711 | 93.03 |
| 1712 | 95.62 |
| 1713 | 98.46 |
| 1714 | 97.46 |
| 1715 | 96.46 |
| 1716 | 95.46 |
| 1717 | 94.46 |
| 1718 | 93.46 |
| 1719 | 92.46 |
| 1720 | 91.46 |
| 1721 | 90.46 |
| 1722 | 89.46 |
| 1723 | 88.46 |
| 1724 | 91.67 |
| 1725 | 90.67 |
| 1726 | 89.67 |
| 1727 | 93.79 |
| 1728 | 96.89 |
| 1729 | 95.89 |
| 1730 | 94.89 |
| 1731 | 97.39 |
| 1732 | 96.39 |
| 1733 | 95.39 |
| 1734 | 94.39 |
| 1735 | 96.61 |
| 1736 | 95.61 |
| 1737 | 94.61 |
| 1738 | 96.72 |
| 1739 | 99.97 |
| 1740 | 98.97 |
| 1741 | 97.97 |
| 1742 | 96.97 |
| 1743 | 99.62 |
| 1744 | 98.62 |
| 1745 | 97.62 |
| 1746 | 96.62 |
| 1747 | 95.62 |
| 1748 | 98.29 |
| 1749 | 97.29 |
| 1750 | 96.29 |
| 1751 | 95.29 |
| 1752 | 94.29 |
| 1753 | 96.83 |
| 1754 | 95.83 |
| 1755 | 94.83 |
| 1756 | 97.52 |
| 1757 | 100.96 |
| 1758 | 99.96 |
| 1759 | 98.96 |
| 1760 | 101.46 |
| 1761 | 105.97 |
| 1762 | 109.2 |
| 1763 | 108.2 |
| 1764 | 107.2 |
| 1765 | 109.36 |
| 1766 | 108.36 |
| 1767 | 107.36 |
| 1768 | 109.99 |
| 1769 | 108.99 |
| 1770 | 107.99 |
| 1771 | 111.57 |
| 1772 | 110.57 |
| 1773 | 113.8 |
| 1774 | 112.8 |
| 1775 | 111.8 |
| 1776 | 114.35 |
| 1777 | 113.35 |
| 1778 | 112.35 |
| 1779 | 111.35 |
| 1780 | 110.35 |
| 1781 | 109.35 |
| 1782 | 108.35 |
| 1783 | 107.35 |
| 1784 | 109.91 |
| 1785 | 108.91 |
| 1786 | 107.91 |
| 1787 | 110.07 |
| 1788 | 109.07 |
| 1789 | 108.07 |
| 1790 | 112.11 |
| 1791 | 114.59 |
| 1792 | 113.59 |
| 1793 | 112.59 |
| 1794 | 111.59 |
| 1795 | 110.59 |
| 1796 | 109.59 |
| 1797 | 108.59 |
| 1798 | 107.59 |
| 1799 | 110.25 |
| 1800 | 113.02 |
| 1801 | 112.02 |
| 1802 | 111.02 |
| 1803 | 114.35 |
| 1804 | 113.35 |
| 1805 | 112.35 |
| 1806 | 111.35 |
| 1807 | 113.97 |
| 1808 | 117.28 |
| 1809 | 119.86 |
| 1810 | 122.13 |
| 1811 | 124.38 |
| 1812 | 123.38 |
| 1813 | 122.38 |
| 1814 | 121.38 |
| 1815 | 120.38 |
| 1816 | 119.38 |
| 1817 | 118.38 |
| 1818 | 121.17 |
| 1819 | 120.17 |
| 1820 | 119.17 |
| 1821 | 118.17 |
| 1822 | 117.17 |
| 1823 | 116.17 |
| 1824 | 115.17 |
| 1825 | 114.17 |
| 1826 | 113.17 |
| 1827 | 112.17 |
| 1828 | 111.17 |
| 1829 | 110.17 |
| 1830 | 109.17 |
| 1831 | 111.42 |
| 1832 | 110.42 |
| 1833 | 109.42 |
| 1834 | 108.42 |
| 1835 | 107.42 |
| 1836 | 106.42 |
| 1837 | 105.42 |
| 1838 | 104.42 |
| 1839 | 103.42 |
| 1840 | 102.42 |
| 1841 | 104.61 |
| 1842 | 103.61 |
| 1843 | 102.61 |
| 1844 | 105.07 |
| 1845 | 104.07 |
| 1846 | 103.07 |
| 1847 | 102.07 |
| 1848 | 101.07 |
| 1849 | 100.07 |
| 1850 | 99.07 |
| 1851 | 101.57 |
| 1852 | 100.57 |
| 1853 | 102.53 |
| 1854 | 105.37 |
| 1855 | 104.37 |
| 1856 | 103.37 |
| 1857 | 105.83 |
| 1858 | 104.83 |
| 1859 | 103.83 |
| 1860 | 102.83 |
| 1861 | 101.83 |
| 1862 | 100.83 |
| 1863 | 99.83 |
| 1864 | 98.83 |
| 1865 | 97.83 |
| 1866 | 96.83 |
| 1867 | 100.55 |
| 1868 | 99.55 |
| 1869 | 98.55 |
| 1870 | 97.55 |
| 1871 | 96.55 |
| 1872 | 100.08 |
| 1873 | 102.98 |
| 1874 | 101.98 |
| 1875 | 100.98 |
| 1876 | 99.98 |
| 1877 | 98.98 |
| 1878 | 97.98 |
| 1879 | 96.98 |
| 1880 | 95.98 |
| 1881 | 94.98 |
| 1882 | 96.93 |
| 1883 | 95.93 |
| 1884 | 98.77 |
| 1885 | 101.91 |
| 1886 | 100.91 |
| 1887 | 99.91 |
| 1888 | 98.91 |
| 1889 | 97.91 |
| 1890 | 96.91 |
| 1891 | 99.1 |
| 1892 | 98.1 |
| 1893 | 97.1 |
| 1894 | 96.1 |
| 1895 | 95.1 |
| 1896 | 94.1 |
| 1897 | 93.1 |
| 1898 | 92.1 |
| 1899 | 91.1 |
| 1900 | 90.1 |
| 1901 | 89.1 |
| 1902 | 88.1 |
| 1903 | 87.1 |
| 1904 | 91.82 |
| 1905 | 90.82 |
| 1906 | 92.91 |
| 1907 | 91.91 |
| 1908 | 95.24 |
| 1909 | 98.67 |
| 1910 | 100.74 |
| 1911 | 103.81 |
| 1912 | 102.81 |
| 1913 | 105.2 |
| 1914 | 107.71 |
| 1915 | 110.31 |
| 1916 | 109.31 |
| 1917 | 111.46 |
| 1918 | 110.46 |
| 1919 | 109.46 |
| 1920 | 108.46 |
| 1921 | 107.46 |
| 1922 | 106.46 |
| 1923 | 109.38 |
| 1924 | 108.38 |
| 1925 | 107.38 |
| 1926 | 106.38 |
| 1927 | 105.38 |
| 1928 | 104.38 |
| 1929 | 103.38 |
| 1930 | 102.38 |
| 1931 | 104.34 |
| 1932 | 103.34 |
| 1933 | 102.34 |
| 1934 | 101.34 |
| 1935 | 100.34 |
| 1936 | 99.34 |
| 1937 | 98.34 |
| 1938 | 97.34 |
| 1939 | 100.49 |
| 1940 | 99.49 |
| 1941 | 103.1 |
| 1942 | 102.1 |
| 1943 | 101.1 |
| 1944 | 100.1 |
| 1945 | 102.51 |
| 1946 | 101.51 |
| 1947 | 100.51 |
| 1948 | 99.51 |
| 1949 | 98.51 |
| 1950 | 101.3 |
| 1951 | 100.3 |
| 1952 | 99.3 |
| 1953 | 98.3 |
| 1954 | 97.3 |
| 1955 | 96.3 |
| 1956 | 95.3 |
| 1957 | 94.3 |
| 1958 | 98.54 |
| 1959 | 97.54 |
| 1960 | 96.54 |
| 1961 | 98.79 |
| 1962 | 97.79 |
| 1963 | 96.79 |
| 1964 | 95.79 |
| 1965 | 101.01 |
| 1966 | 100.01 |
| 1967 | 99.01 |
| 1968 | 98.01 |
| 1969 | 100.21 |
| 1970 | 99.21 |
| 1971 | 98.21 |
| 1972 | 97.21 |
| 1973 | 96.21 |
| 1974 | 95.21 |
| 1975 | 97.64 |
| 1976 | 96.64 |
| 1977 | 95.64 |
| 1978 | 99.85 |
| 1979 | 98.85 |
| 1980 | 97.85 |
| 1981 | 96.85 |
| 1982 | 95.85 |
| 1983 | 94.85 |
| 1984 | 93.85 |
| 1985 | 92.85 |
| 1986 | 91.85 |
| 1987 | 90.85 |
| 1988 | 89.85 |
| 1989 | 88.85 |
| 1990 | 87.85 |
| 1991 | 89.96 |
| 1992 | 88.96 |
| 1993 | 87.96 |
| 1994 | 86.96 |
| 1995 | 85.93 |
| 1996 | 84.93 |
| 1997 | 87.43 |
| 1998 | 89.26 |
| 1999 | 91.56 |
| 2000 | 90.56 |
| 2001 | 89.56 |
| 2002 | 88.56 |
| 2003 | 90.95 |
| 2004 | 93.42 |
| 2005 | 92.42 |
| 2006 | 95.46 |
| 2007 | 98.13 |
| 2008 | 100.44 |
| 2009 | 99.44 |
| 2010 | 98.44 |
| 2011 | 100.74 |
| 2012 | 103.47 |
| 2013 | 102.47 |
| 2014 | 101.47 |
| 2015 | 100.47 |
| 2016 | 99.47 |
| 2017 | 98.47 |
| 2018 | 101.68 |